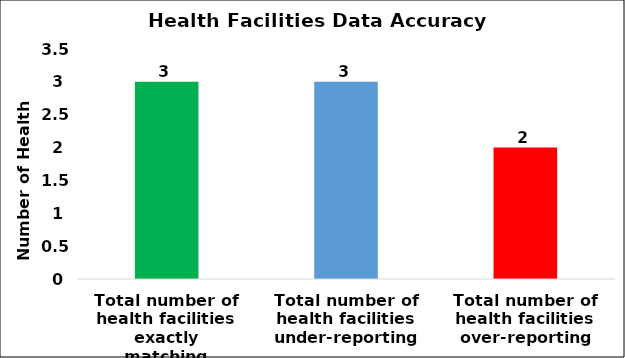
| Category | Number |
|---|---|
| Total number of health facilities over-reporting | 2 |
| Total number of health facilities under-reporting | 3 |
| Total number of health facilities exactly matching | 3 |